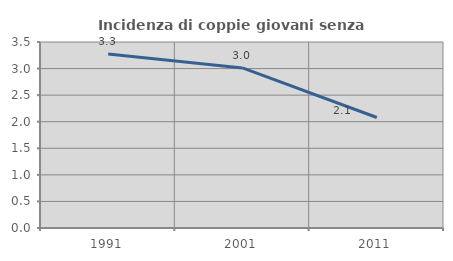
| Category | Incidenza di coppie giovani senza figli |
|---|---|
| 1991.0 | 3.275 |
| 2001.0 | 3.012 |
| 2011.0 | 2.079 |